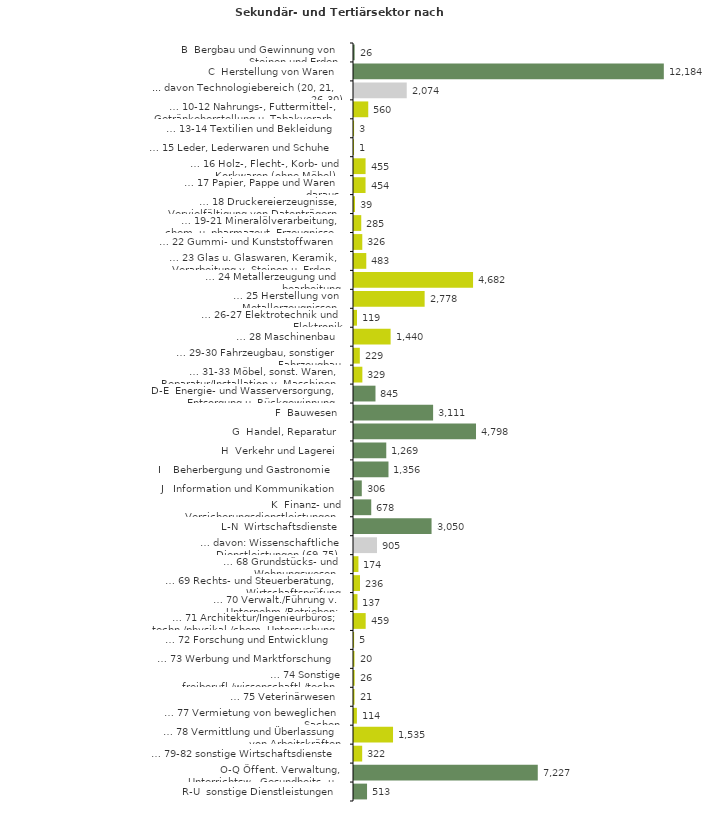
| Category | Series 0 |
|---|---|
| B  Bergbau und Gewinnung von Steinen und Erden | 26 |
| C  Herstellung von Waren | 12184 |
| ... davon Technologiebereich (20, 21, 26-30) | 2074 |
| … 10-12 Nahrungs-, Futtermittel-, Getränkeherstellung u. Tabakverarb. | 560 |
| … 13-14 Textilien und Bekleidung | 3 |
| … 15 Leder, Lederwaren und Schuhe | 1 |
| … 16 Holz-, Flecht-, Korb- und Korkwaren (ohne Möbel)  | 455 |
| … 17 Papier, Pappe und Waren daraus  | 454 |
| … 18 Druckereierzeugnisse, Vervielfältigung von Datenträgern | 39 |
| … 19-21 Mineralölverarbeitung, chem. u. pharmazeut. Erzeugnisse | 285 |
| … 22 Gummi- und Kunststoffwaren | 326 |
| … 23 Glas u. Glaswaren, Keramik, Verarbeitung v. Steinen u. Erden  | 483 |
| … 24 Metallerzeugung und -bearbeitung | 4682 |
| … 25 Herstellung von Metallerzeugnissen  | 2778 |
| … 26-27 Elektrotechnik und Elektronik | 119 |
| … 28 Maschinenbau | 1440 |
| … 29-30 Fahrzeugbau, sonstiger Fahrzeugbau | 229 |
| … 31-33 Möbel, sonst. Waren, Reparatur/Installation v. Maschinen | 329 |
| D-E  Energie- und Wasserversorgung, Entsorgung u. Rückgewinnung | 845 |
| F  Bauwesen | 3111 |
| G  Handel, Reparatur | 4798 |
| H  Verkehr und Lagerei | 1269 |
| I    Beherbergung und Gastronomie | 1356 |
| J   Information und Kommunikation | 306 |
| K  Finanz- und Versicherungsdienstleistungen | 678 |
| L-N  Wirtschaftsdienste | 3050 |
| … davon: Wissenschaftliche Dienstleistungen (69-75) | 905 |
| … 68 Grundstücks- und Wohnungswesen  | 174 |
| … 69 Rechts- und Steuerberatung, Wirtschaftsprüfung | 236 |
| … 70 Verwalt./Führung v. Unternehm./Betrieben; Unternehmensberat. | 137 |
| … 71 Architektur/Ingenieurbüros; techn./physikal./chem. Untersuchung | 459 |
| … 72 Forschung und Entwicklung  | 5 |
| … 73 Werbung und Marktforschung | 20 |
| … 74 Sonstige freiberufl./wissenschaftl./techn. Tätigkeiten | 26 |
| … 75 Veterinärwesen | 21 |
| … 77 Vermietung von beweglichen Sachen  | 114 |
| … 78 Vermittlung und Überlassung von Arbeitskräften | 1535 |
| … 79-82 sonstige Wirtschaftsdienste | 322 |
| O-Q Öffent. Verwaltung, Unterrichtsw., Gesundheits- u. Sozialwesen | 7227 |
| R-U  sonstige Dienstleistungen | 513 |